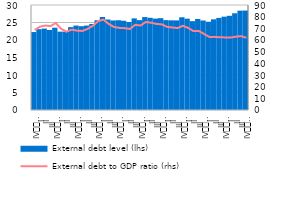
| Category | External debt level (lhs) |
|---|---|
| IV
2009 | 22.272 |
| I | 23.09 |
| II | 23.254 |
| III | 22.861 |
| IV
2010 | 23.509 |
| I | 22.384 |
| II | 22.4 |
| III | 23.676 |
| IV
2011 | 24.123 |
| I | 23.947 |
| II | 24.124 |
| III | 24.565 |
| IV
2012 | 25.645 |
| I | 26.582 |
| II | 25.858 |
| III | 25.582 |
| IV
2013 | 25.644 |
| I | 25.497 |
| II | 25.144 |
| III | 26.171 |
| IV
2014 | 25.679 |
| I | 26.552 |
| II | 26.348 |
| III | 26.111 |
| IV
2015 | 26.234 |
| I | 25.682 |
| II | 25.621 |
| III | 25.603 |
| IV
2016 | 26.494 |
| I | 26.091 |
| II | 25.389 |
| III | 25.999 |
| IV
2017 | 25.578 |
| I | 25.216 |
| II | 25.906 |
| III | 26.312 |
| IV
2018 | 26.662 |
| I | 26.913 |
| II | 27.631 |
| III | 28.381 |
| IV
2019 | 28.418 |